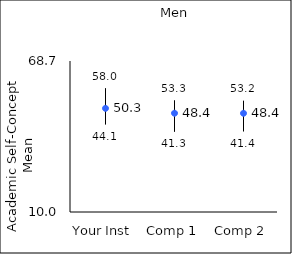
| Category | 25th percentile | 75th percentile | Mean |
|---|---|---|---|
| Your Inst | 44.1 | 58 | 50.3 |
| Comp 1 | 41.3 | 53.3 | 48.4 |
| Comp 2 | 41.4 | 53.2 | 48.38 |